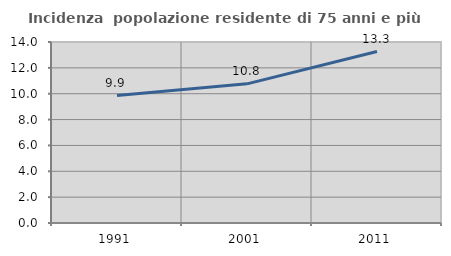
| Category | Incidenza  popolazione residente di 75 anni e più |
|---|---|
| 1991.0 | 9.861 |
| 2001.0 | 10.762 |
| 2011.0 | 13.262 |